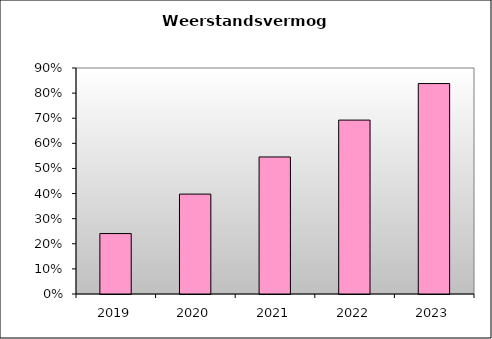
| Category | Series 0 |
|---|---|
| 2019.0 | 0.241 |
| 2020.0 | 0.398 |
| 2021.0 | 0.546 |
| 2022.0 | 0.692 |
| 2023.0 | 0.838 |